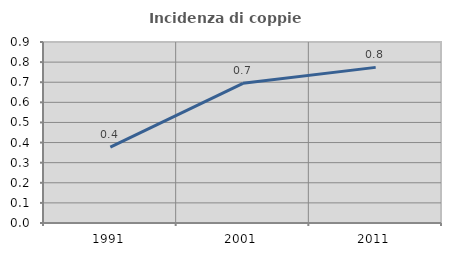
| Category | Incidenza di coppie miste |
|---|---|
| 1991.0 | 0.377 |
| 2001.0 | 0.695 |
| 2011.0 | 0.774 |